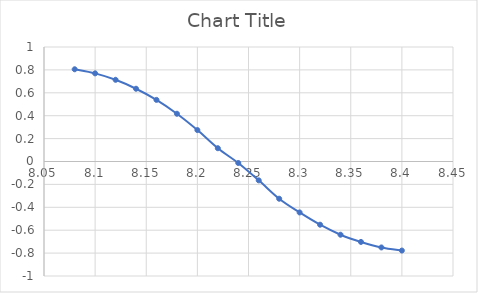
| Category | Series 0 |
|---|---|
| 8.08 | 0.806 |
| 8.1 | 0.77 |
| 8.12 | 0.714 |
| 8.14 | 0.635 |
| 8.16 | 0.538 |
| 8.18 | 0.417 |
| 8.2 | 0.274 |
| 8.22 | 0.116 |
| 8.24 | -0.013 |
| 8.26 | -0.165 |
| 8.28 | -0.325 |
| 8.3 | -0.445 |
| 8.31999999999999 | -0.552 |
| 8.33999999999999 | -0.64 |
| 8.35999999999999 | -0.702 |
| 8.37999999999999 | -0.751 |
| 8.39999999999999 | -0.778 |